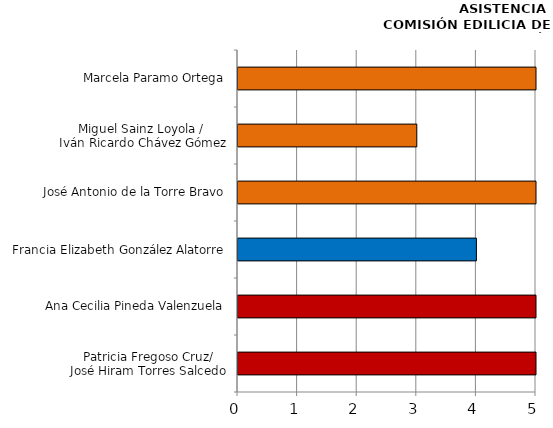
| Category | Series 0 |
|---|---|
| Patricia Fregoso Cruz/
José Hiram Torres Salcedo | 5 |
| Ana Cecilia Pineda Valenzuela | 5 |
| Francia Elizabeth González Alatorre | 4 |
| José Antonio de la Torre Bravo | 5 |
| Miguel Sainz Loyola / 
Iván Ricardo Chávez Gómez | 3 |
| Marcela Paramo Ortega | 5 |